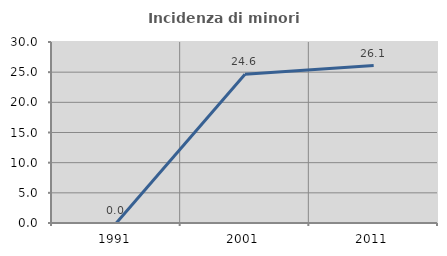
| Category | Incidenza di minori stranieri |
|---|---|
| 1991.0 | 0 |
| 2001.0 | 24.638 |
| 2011.0 | 26.087 |